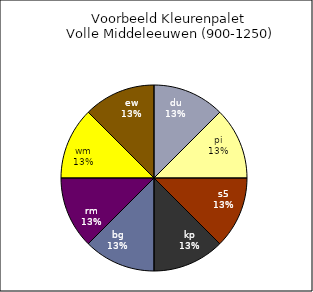
| Category | Series 0 |
|---|---|
| du | 1 |
| pi | 1 |
| s5 | 1 |
| kp | 1 |
| bg | 1 |
| rm | 1 |
| wm | 1 |
| ew | 1 |